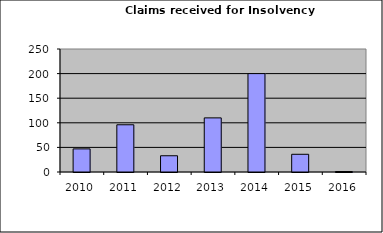
| Category | Series 0 |
|---|---|
| 2010.0 | 47 |
| 2011.0 | 96 |
| 2012.0 | 33 |
| 2013.0 | 110 |
| 2014.0 | 200 |
| 2015.0 | 36 |
| 2016.0 | 1 |